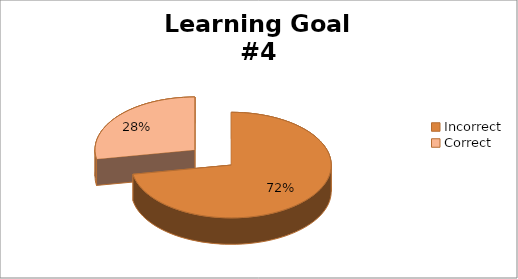
| Category | Series 0 |
|---|---|
| Incorrect  | 13 |
| Correct  | 5 |